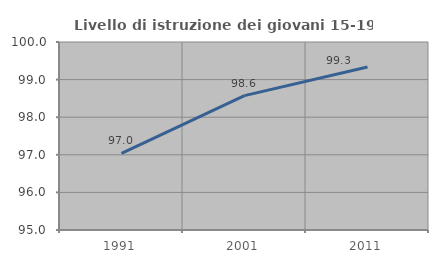
| Category | Livello di istruzione dei giovani 15-19 anni |
|---|---|
| 1991.0 | 97.04 |
| 2001.0 | 98.575 |
| 2011.0 | 99.335 |